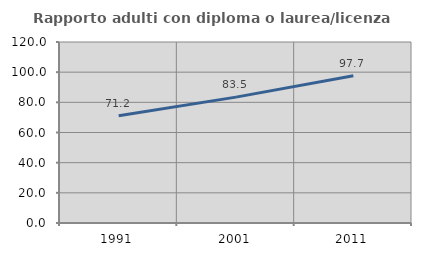
| Category | Rapporto adulti con diploma o laurea/licenza media  |
|---|---|
| 1991.0 | 71.157 |
| 2001.0 | 83.451 |
| 2011.0 | 97.658 |